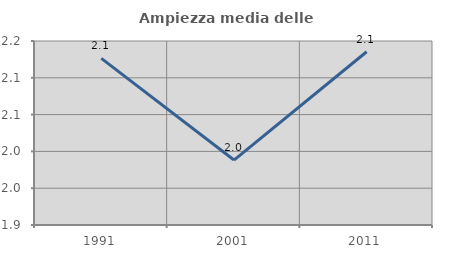
| Category | Ampiezza media delle famiglie |
|---|---|
| 1991.0 | 2.126 |
| 2001.0 | 1.988 |
| 2011.0 | 2.135 |